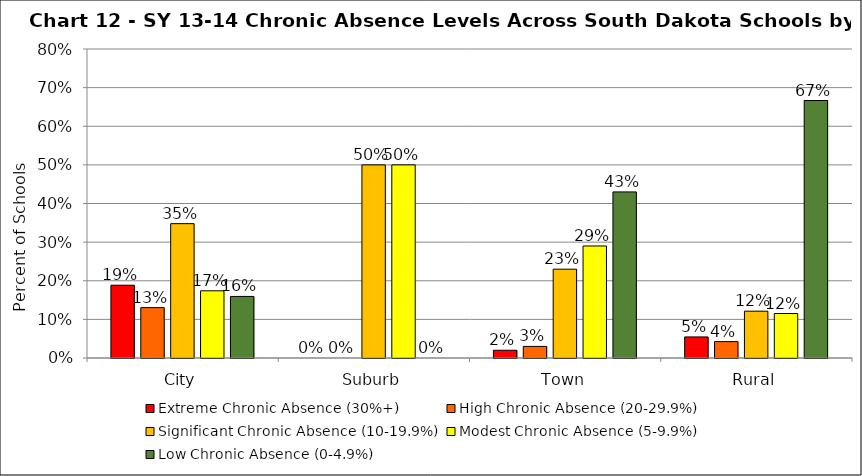
| Category | Extreme Chronic Absence (30%+) | High Chronic Absence (20-29.9%) | Significant Chronic Absence (10-19.9%) | Modest Chronic Absence (5-9.9%) | Low Chronic Absence (0-4.9%) |
|---|---|---|---|---|---|
| 0 | 0.188 | 0.13 | 0.348 | 0.174 | 0.159 |
| 1 | 0 | 0 | 0.5 | 0.5 | 0 |
| 2 | 0.02 | 0.03 | 0.23 | 0.29 | 0.43 |
| 3 | 0.055 | 0.042 | 0.121 | 0.115 | 0.667 |